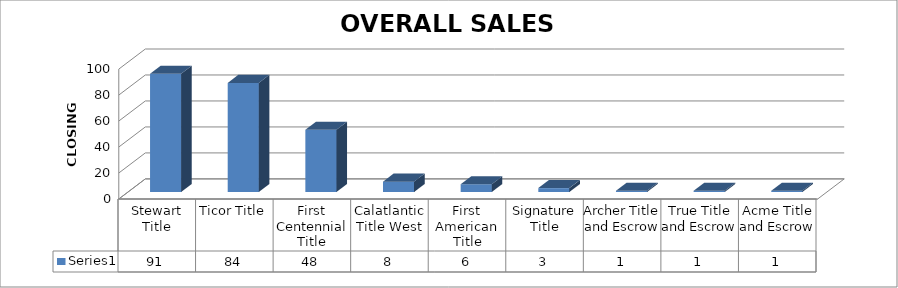
| Category | Series 0 |
|---|---|
| Stewart Title | 91 |
| Ticor Title | 84 |
| First Centennial Title | 48 |
| Calatlantic Title West | 8 |
| First American Title | 6 |
| Signature Title | 3 |
| Archer Title and Escrow | 1 |
| True Title and Escrow | 1 |
| Acme Title and Escrow | 1 |